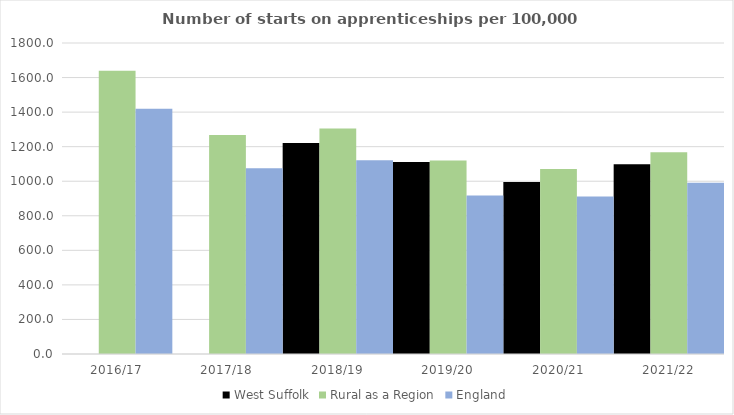
| Category | West Suffolk | Rural as a Region | England |
|---|---|---|---|
| 2016/17 | 0 | 1638.789 | 1420 |
| 2017/18 | 0 | 1267.474 | 1075 |
| 2018/19 | 1221 | 1304.57 | 1122 |
| 2019/20 | 1111 | 1119.662 | 918 |
| 2020/21 | 996 | 1070.748 | 912 |
| 2021/22 | 1098 | 1167.68 | 991 |